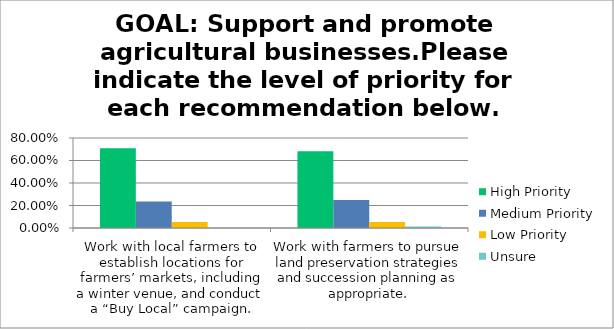
| Category | High Priority | Medium Priority | Low Priority | Unsure |
|---|---|---|---|---|
| Work with local farmers to establish locations for farmers’ markets, including a winter venue, and conduct a “Buy Local” campaign. | 0.71 | 0.236 | 0.054 | 0 |
| Work with farmers to pursue land preservation strategies and succession planning as appropriate. | 0.682 | 0.25 | 0.054 | 0.014 |